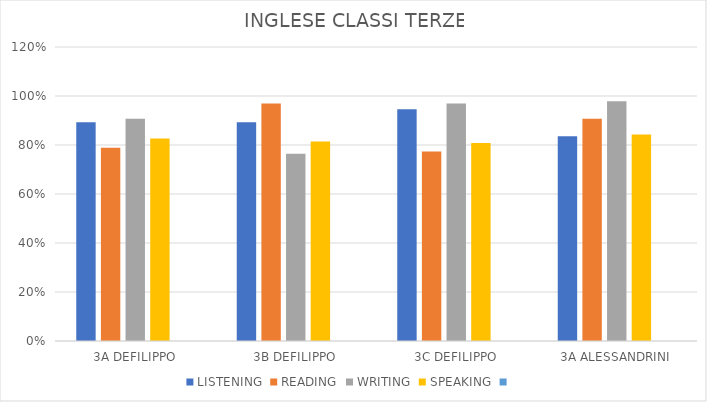
| Category | LISTENING | READING | WRITING | SPEAKING |   |
|---|---|---|---|---|---|
| 3A DEFILIPPO | 0.893 | 0.789 | 0.907 | 0.827 | 0 |
| 3B DEFILIPPO | 0.893 | 0.969 | 0.764 | 0.814 | 0 |
| 3C DEFILIPPO | 0.946 | 0.773 | 0.969 | 0.808 | 0 |
| 3A ALESSANDRINI | 0.836 | 0.907 | 0.979 | 0.843 | 0 |